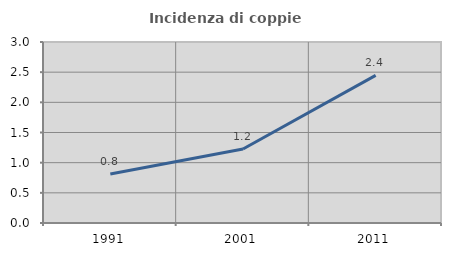
| Category | Incidenza di coppie miste |
|---|---|
| 1991.0 | 0.812 |
| 2001.0 | 1.226 |
| 2011.0 | 2.446 |